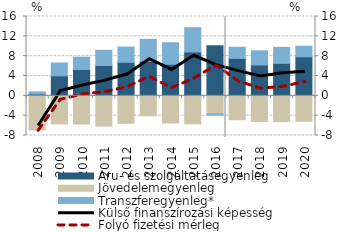
| Category | Áru- és szolgáltatásegyenleg | Jövedelemegyenleg | Transzferegyenleg* |
|---|---|---|---|
| 2008.0 | 0.357 | -6.883 | 0.435 |
| 2009.0 | 4.031 | -5.668 | 2.592 |
| 2010.0 | 5.32 | -5.693 | 2.467 |
| 2011.0 | 6.13 | -6.106 | 3.042 |
| 2012.0 | 6.766 | -5.543 | 3.075 |
| 2013.0 | 6.964 | -4.021 | 4.439 |
| 2014.0 | 6.376 | -5.476 | 4.328 |
| 2015.0 | 8.853 | -5.655 | 4.879 |
| 2016.0 | 10.09 | -3.63 | -0.258 |
| 2017.0 | 7.552 | -4.815 | 2.254 |
| 2018.0 | 6.224 | -5.16 | 2.849 |
| 2019.0 | 6.549 | -5.199 | 3.223 |
| 2020.0 | 7.869 | -5.132 | 2.127 |